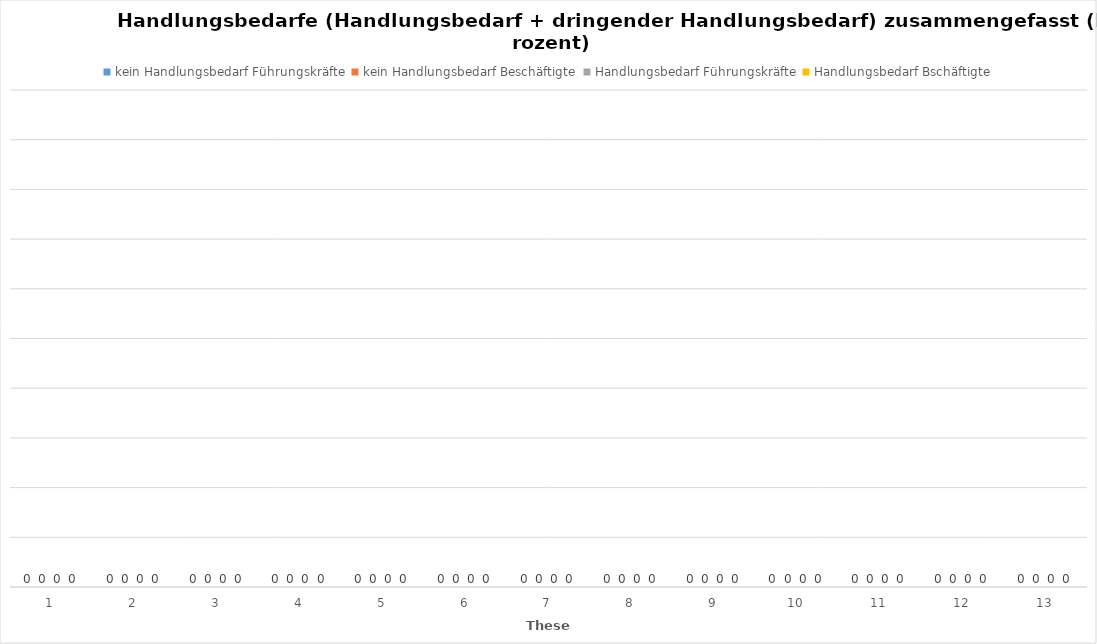
| Category | kein Handlungsbedarf Führungskräfte | kein Handlungsbedarf Beschäftigte | Handlungsbedarf Führungskräfte | Handlungsbedarf Bschäftigte |
|---|---|---|---|---|
| 1.0 | 0 | 0 | 0 | 0 |
| 2.0 | 0 | 0 | 0 | 0 |
| 3.0 | 0 | 0 | 0 | 0 |
| 4.0 | 0 | 0 | 0 | 0 |
| 5.0 | 0 | 0 | 0 | 0 |
| 6.0 | 0 | 0 | 0 | 0 |
| 7.0 | 0 | 0 | 0 | 0 |
| 8.0 | 0 | 0 | 0 | 0 |
| 9.0 | 0 | 0 | 0 | 0 |
| 10.0 | 0 | 0 | 0 | 0 |
| 11.0 | 0 | 0 | 0 | 0 |
| 12.0 | 0 | 0 | 0 | 0 |
| 13.0 | 0 | 0 | 0 | 0 |